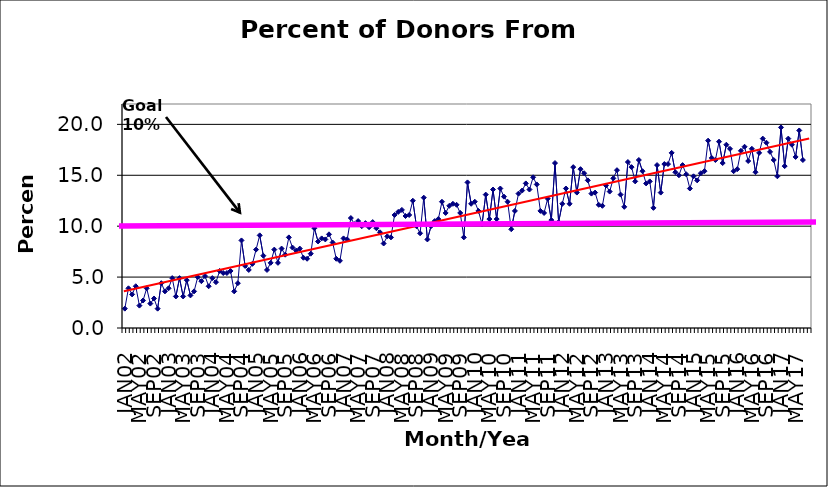
| Category | Series 0 |
|---|---|
| JAN02 | 1.9 |
| FEB02 | 3.9 |
| MAR02 | 3.3 |
| APR02 | 4.1 |
| MAY02 | 2.2 |
| JUN02 | 2.7 |
| JUL02 | 3.9 |
| AUG02 | 2.4 |
| SEP02 | 2.9 |
| OCT02 | 1.9 |
| NOV02 | 4.4 |
| DEC02 | 3.6 |
| JAN03 | 3.9 |
| FEB03 | 4.9 |
| MAR03 | 3.1 |
| APR03 | 4.9 |
| MAY03 | 3.1 |
| JUN03 | 4.7 |
| JUL03 | 3.2 |
| AUG03 | 3.6 |
| SEP03 | 5 |
| OCT03 | 4.6 |
| NOV03 | 5.1 |
| DEC03 | 4.1 |
| JAN04 | 4.9 |
| FEB04 | 4.5 |
| MAR04 | 5.6 |
| APR04 | 5.4 |
| MAY04 | 5.4 |
| JUN04 | 5.6 |
| JUL04 | 3.6 |
| AUG04 | 4.4 |
| SEP04 | 8.6 |
| OCT04 | 6.1 |
| NOV04 | 5.7 |
| DEC04 | 6.3 |
| JAN05 | 7.7 |
| FEB05 | 9.1 |
| MAR05 | 7.1 |
| APR05 | 5.7 |
| MAY05 | 6.4 |
| JUN05 | 7.7 |
| JUL05 | 6.4 |
| AUG05 | 7.8 |
| SEP05 | 7.2 |
| OCT05 | 8.9 |
| NOV05 | 7.9 |
| DEC05 | 7.6 |
| JAN06 | 7.8 |
| FEB06 | 6.9 |
| MAR06 | 6.8 |
| APR06 | 7.3 |
| MAY06 | 9.8 |
| JUN06 | 8.5 |
| JUL06 | 8.8 |
| AUG06 | 8.7 |
| SEP06 | 9.2 |
| OCT06 | 8.4 |
| NOV06 | 6.8 |
| DEC06 | 6.6 |
| JAN07 | 8.8 |
| FEB07 | 8.7 |
| MAR07 | 10.8 |
| APR07 | 10.2 |
| MAY07 | 10.5 |
| JUN07 | 10 |
| JUL07 | 10.3 |
| AUG07 | 9.9 |
| SEP07 | 10.4 |
| OCT07 | 9.8 |
| NOV07 | 9.4 |
| DEC07 | 8.3 |
| JAN08 | 9 |
| FEB08 | 8.9 |
| MAR08 | 11.1 |
| APR08 | 11.4 |
| MAY08 | 11.6 |
| JUN08 | 11 |
| JUL08 | 11.1 |
| AUG08 | 12.5 |
| SEP08 | 10 |
| OCT08 | 9.3 |
| NOV08 | 12.8 |
| DEC08 | 8.7 |
| JAN09 | 10 |
| FEB09 | 10.5 |
| MAR09 | 10.7 |
| APR09 | 12.4 |
| MAY09 | 11.3 |
| JUN09 | 12 |
| JUL09 | 12.2 |
| AUG09 | 12.1 |
| SEP09 | 11.3 |
| OCT09 | 8.9 |
| NOV09 | 14.3 |
| DEC09 | 12.2 |
| JAN10 | 12.4 |
| FEB10 | 11.5 |
| MAR10 | 10.2 |
| APR10 | 13.1 |
| MAY10 | 10.7 |
| JUN10 | 13.6 |
| JUL10 | 10.7 |
| AUG10 | 13.7 |
| SEP10 | 12.9 |
| OCT10 | 12.4 |
| NOV10 | 9.7 |
| DEC10 | 11.5 |
| JAN11 | 13.2 |
| FEB11 | 13.5 |
| MAR11 | 14.2 |
| APR11 | 13.6 |
| MAY11 | 14.8 |
| JUN11 | 14.1 |
| JUL11 | 11.5 |
| AUG11 | 11.3 |
| SEP11 | 12.7 |
| OCT11 | 10.6 |
| NOV11 | 16.2 |
| DEC11 | 10.4 |
| JAN12 | 12.2 |
| FEB12 | 13.7 |
| MAR12 | 12.2 |
| APR12 | 15.8 |
| MAY12 | 13.3 |
| JUN12 | 15.6 |
| JUL12 | 15.2 |
| AUG12 | 14.5 |
| SEP12 | 13.2 |
| OCT12 | 13.3 |
| NOV12 | 12.1 |
| DEC12 | 12 |
| JAN13 | 14 |
| FEB13 | 13.4 |
| MAR13 | 14.7 |
| APR13 | 15.5 |
| MAY13 | 13.1 |
| JUN13 | 11.9 |
| JUL13 | 16.3 |
| AUG13 | 15.8 |
| SEP13 | 14.4 |
| OCT13 | 16.5 |
| NOV13 | 15.4 |
| DEC13 | 14.2 |
| JAN14 | 14.4 |
| FEB14 | 11.8 |
| MAR14 | 16 |
| APR14 | 13.3 |
| MAY14 | 16.1 |
| JUN14 | 16.1 |
| JUL14 | 17.2 |
| AUG14 | 15.3 |
| SEP14 | 15 |
| OCT14 | 16 |
| NOV14 | 15.1 |
| DEC14 | 13.7 |
| JAN15 | 14.9 |
| FEB15 | 14.5 |
| MAR15 | 15.2 |
| APR15 | 15.4 |
| MAY15 | 18.4 |
| JUN15 | 16.7 |
| JUL15 | 16.5 |
| AUG15 | 18.3 |
| SEP15 | 16.2 |
| OCT15 | 18 |
| NOV15 | 17.6 |
| DEC15 | 15.4 |
| JAN16 | 15.6 |
| FEB16 | 17.4 |
| MAR16 | 17.8 |
| APR16 | 16.4 |
| MAY16 | 17.6 |
| JUN16 | 15.3 |
| JUL16 | 17.2 |
| AUG16 | 18.6 |
| SEP16 | 18.2 |
| OCT16 | 17.3 |
| NOV16 | 16.5 |
| DEC16 | 14.9 |
| JAN17 | 19.7 |
| FEB17 | 15.9 |
| MAR17 | 18.6 |
| APR17 | 18 |
| MAY17 | 16.8 |
| JUN17 | 19.4 |
| JUL17 | 16.5 |